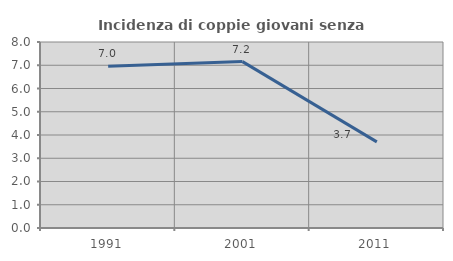
| Category | Incidenza di coppie giovani senza figli |
|---|---|
| 1991.0 | 6.962 |
| 2001.0 | 7.156 |
| 2011.0 | 3.704 |